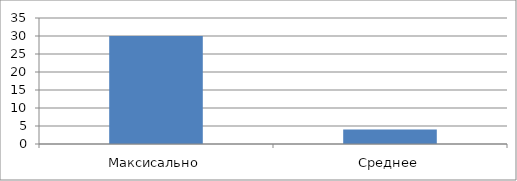
| Category | Series 0 |
|---|---|
| Максисально | 30 |
| Среднее | 3.993 |